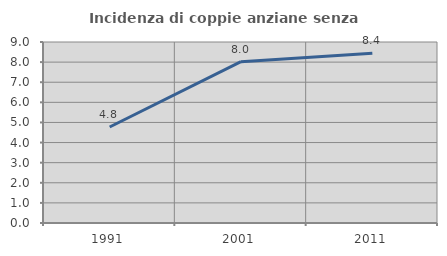
| Category | Incidenza di coppie anziane senza figli  |
|---|---|
| 1991.0 | 4.774 |
| 2001.0 | 8.02 |
| 2011.0 | 8.443 |